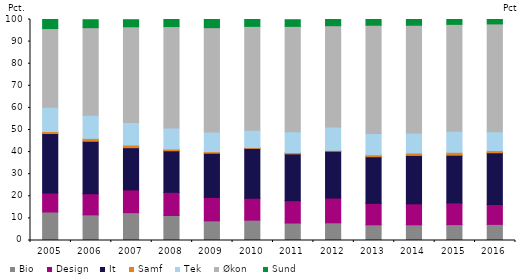
| Category | Bio | Design | It | Samf | Tek | Økon  | Sund |
|---|---|---|---|---|---|---|---|
| 2005.0 | 12.9 | 8.6 | 26.9 | 0.9 | 11 | 35.6 | 4.2 |
| 2006.0 | 11.6 | 9.6 | 23.7 | 1.3 | 10.5 | 39.6 | 3.6 |
| 2007.0 | 12.6 | 10.3 | 19.1 | 1.2 | 10.2 | 43.3 | 3.2 |
| 2008.0 | 11.3 | 10.5 | 18.8 | 0.8 | 9.5 | 45.9 | 3.2 |
| 2009.0 | 8.9 | 10.6 | 20 | 0.7 | 8.9 | 47.2 | 3.7 |
| 2010.0 | 9.2 | 9.9 | 22.6 | 0.3 | 7.9 | 47 | 3.1 |
| 2011.0 | 7.9 | 10.1 | 21.2 | 0.6 | 9.4 | 47.7 | 3 |
| 2012.0 | 8 | 11.2 | 21.2 | 0.4 | 10.6 | 45.8 | 2.8 |
| 2013.0 | 7.1 | 9.7 | 21.1 | 0.9 | 9.6 | 49 | 2.7 |
| 2014.0 | 7.1 | 9.5 | 21.9 | 1.1 | 9 | 48.8 | 2.6 |
| 2015.0 | 7.2 | 9.8 | 21.6 | 1.3 | 9.5 | 48.4 | 2.2 |
| 2016.0 | 7.3 | 9 | 23.4 | 1 | 8.5 | 48.8 | 2 |